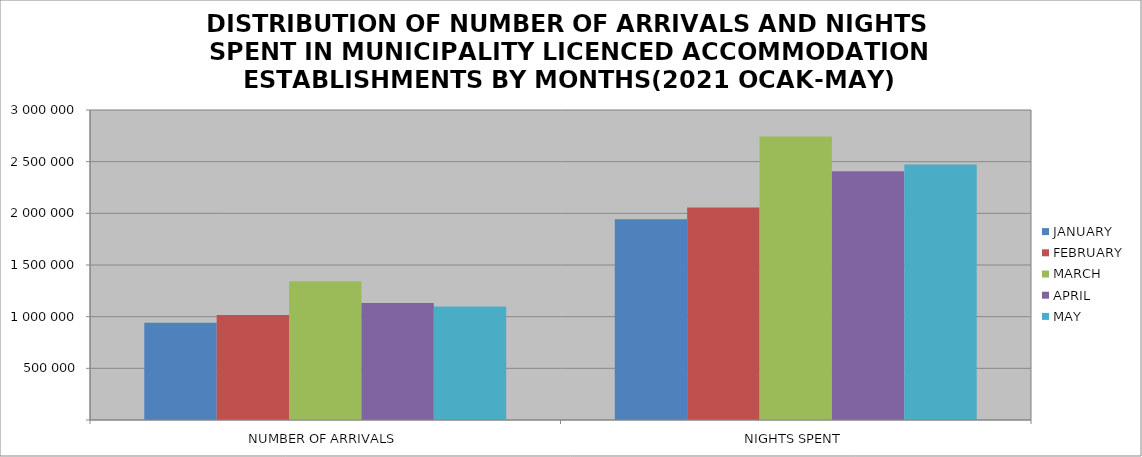
| Category | JANUARY | FEBRUARY | MARCH | APRIL | MAY |
|---|---|---|---|---|---|
| NUMBER OF ARRIVALS | 940331 | 1017199 | 1342202 | 1131069 | 1098456 |
| NIGHTS SPENT | 1943007 | 2056594 | 2743257 | 2406723 | 2471826 |